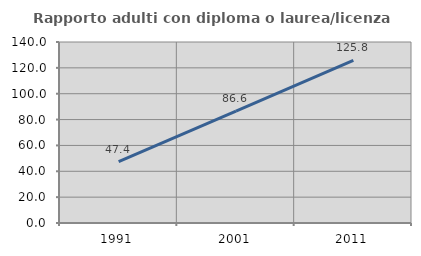
| Category | Rapporto adulti con diploma o laurea/licenza media  |
|---|---|
| 1991.0 | 47.398 |
| 2001.0 | 86.591 |
| 2011.0 | 125.835 |